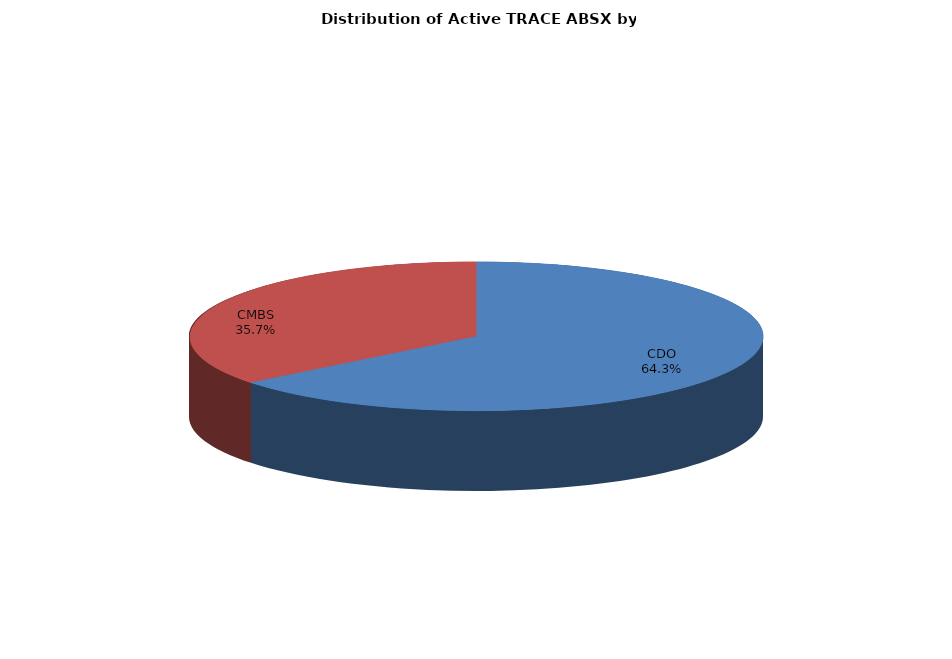
| Category | Series 0 |
|---|---|
| CDO | 28178 |
| CMBS | 15620 |